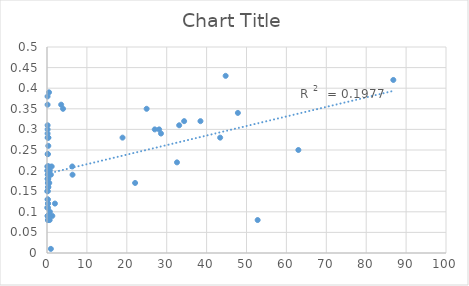
| Category | Series 0 |
|---|---|
| 44.774 | 0.43 |
| 0.15 | 0.29 |
| 47.839 | 0.34 |
| 0.15 | 0.36 |
| 0.566 | 0.17 |
| 0.158 | 0.2 |
| 86.799 | 0.42 |
| 0.158 | 0.3 |
| 28.564 | 0.29 |
| 0.325 | 0.26 |
| 0.233 | 0.17 |
| 33.128 | 0.31 |
| 0.325 | 0.28 |
| 4.015 | 0.35 |
| 27.006 | 0.3 |
| 0.208 | 0.19 |
| 0.208 | 0.24 |
| 0.183 | 0.24 |
| 0.158 | 0.31 |
| 0.2 | 0.13 |
| 0.308 | 0.28 |
| 0.158 | 0.28 |
| 0.508 | 0.39 |
| 0.2 | 0.18 |
| 0.175 | 0.09 |
| 6.397 | 0.19 |
| 1.991 | 0.12 |
| 22.083 | 0.17 |
| 0.125 | 0.2 |
| 18.934 | 0.28 |
| 3.549 | 0.36 |
| 24.973 | 0.35 |
| 1.175 | 0.21 |
| 0.233 | 0.17 |
| 0.075 | 0.15 |
| 0.208 | 0.15 |
| 0.142 | 0.21 |
| 0.183 | 0.18 |
| 0.142 | 0.38 |
| 0.317 | 0.18 |
| 34.37 | 0.32 |
| 38.46 | 0.32 |
| 6.331 | 0.21 |
| 0.067 | 0.11 |
| 0.25 | 0.09 |
| 43.399 | 0.28 |
| 0.15 | 0.21 |
| 0.541 | 0.21 |
| 0.208 | 0.19 |
| 0.233 | 0.21 |
| 28.105 | 0.3 |
| 0.725 | 0.1 |
| 0.158 | 0.13 |
| 0.242 | 0.08 |
| 0.258 | 0.08 |
| 0.258 | 0.11 |
| 63.0 | 0.25 |
| 0.975 | 0.19 |
| 0.167 | 0.09 |
| 1.333 | 0.09 |
| 0.7 | 0.2 |
| 0.666 | 0.08 |
| 0.233 | 0.16 |
| 0.183 | 0.2 |
| 32.579 | 0.22 |
| 0.258 | 0.12 |
| 0.25 | 0.12 |
| 0.192 | 0.18 |
| 0.342 | 0.16 |
| 52.796 | 0.08 |
| 0.966 | 0.01 |